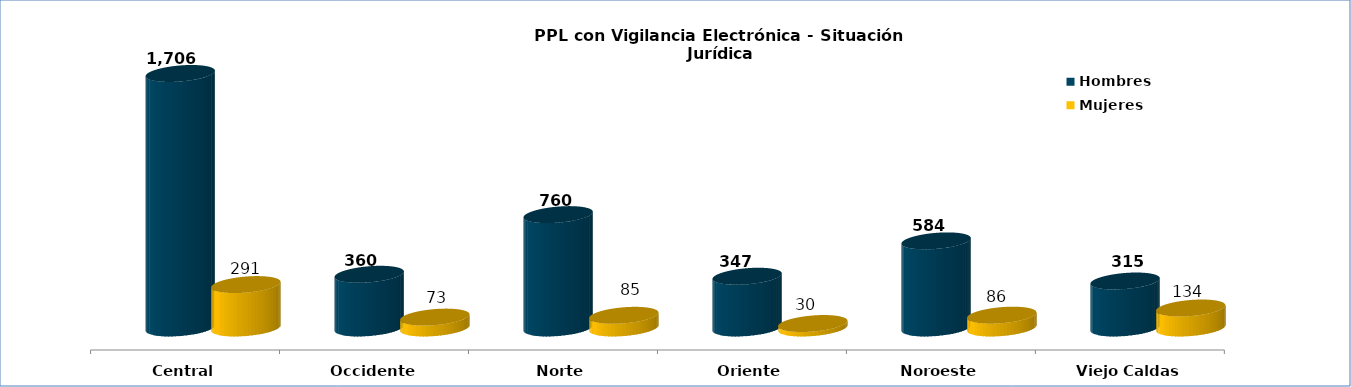
| Category | Hombres | Mujeres |
|---|---|---|
| Central | 1706 | 291 |
| Occidente | 360 | 73 |
| Norte | 760 | 85 |
| Oriente | 347 | 30 |
| Noroeste | 584 | 86 |
| Viejo Caldas | 315 | 134 |